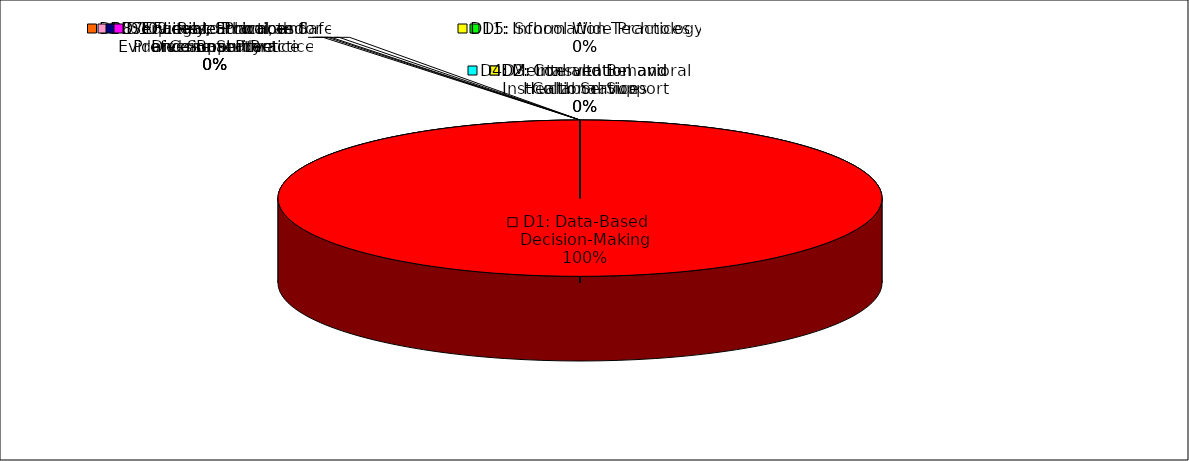
| Category | Series 0 |
|---|---|
| D1: Data-Based Decision-Making | 4 |
| D2: Consultation and Collaboration | 0 |
| D3: Intervention and Instructional Support | 0 |
| D4: Mental and Behavioral Health Services | 0 |
| D5: School Wide Practices | 0 |
| D6: Services to Promote Safe and Supportive  | 0 |
| D7: Family, School, and Community | 0 |
| D8: Equitable Practices for Diverse Student | 0 |
| D9: Research and Evidence-Based Practice | 0 |
| D10:Legal, Ethical and Professional Practice | 0 |
| D11: Information Technology | 0 |